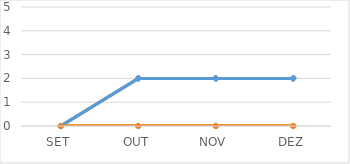
| Category | Series 4 | Series 5 | Series 6 | Series 7 | Series 2 | Series 3 | Series 0 | Series 1 |
|---|---|---|---|---|---|---|---|---|
| SET | 0 | 0 | 0 | 0 | 0 | 0 | 0 | 0 |
| OUT | 2 | 0 | 2 | 0 | 2 | 0 | 2 | 0 |
| NOV | 2 | 0 | 2 | 0 | 2 | 0 | 2 | 0 |
| DEZ | 2 | 0 | 2 | 0 | 2 | 0 | 2 | 0 |